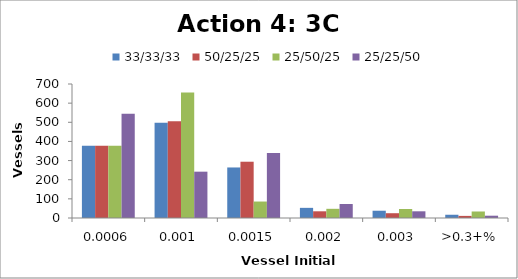
| Category | 33/33/33 | 50/25/25 | 25/50/25 | 25/25/50 |
|---|---|---|---|---|
| 0.060% | 377 | 377 | 377 | 545 |
| 0.100% | 498 | 505 | 655 | 242 |
| 0.150% | 264 | 294 | 86 | 340 |
| 0.200% | 53 | 35 | 48 | 73 |
| 0.300% | 38 | 25 | 47 | 35 |
| >0.3+% | 17 | 11 | 34 | 12 |